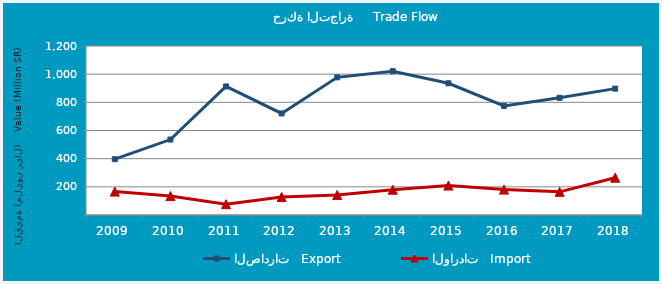
| Category | الصادرات   Export | الواردات   Import |
|---|---|---|
| 2009.0 | 396212151 | 166036608 |
| 2010.0 | 535695449 | 134496483 |
| 2011.0 | 912948487 | 76872214 |
| 2012.0 | 721238086 | 128091843 |
| 2013.0 | 977430366 | 142451281 |
| 2014.0 | 1021172161 | 179458705 |
| 2015.0 | 935492823 | 208951504 |
| 2016.0 | 774687359 | 180337363 |
| 2017.0 | 832233720 | 164377328 |
| 2018.0 | 897296358 | 264959460 |